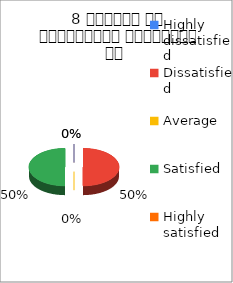
| Category | 8 शिक्षक का सम्प्रेषण सुस्पष्ठ है  |
|---|---|
| Highly dissatisfied | 0 |
| Dissatisfied | 1 |
| Average | 0 |
| Satisfied | 1 |
| Highly satisfied | 0 |